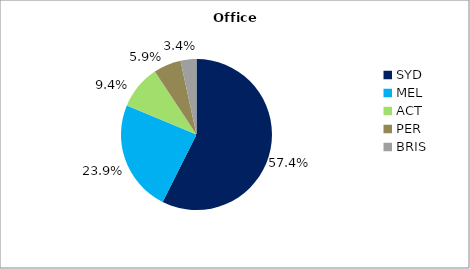
| Category | Series 0 |
|---|---|
| SYD | 0.574 |
| MEL | 0.239 |
| ACT | 0.094 |
| PER | 0.059 |
| BRIS | 0.034 |